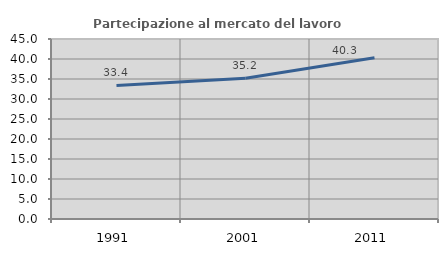
| Category | Partecipazione al mercato del lavoro  femminile |
|---|---|
| 1991.0 | 33.39 |
| 2001.0 | 35.213 |
| 2011.0 | 40.31 |